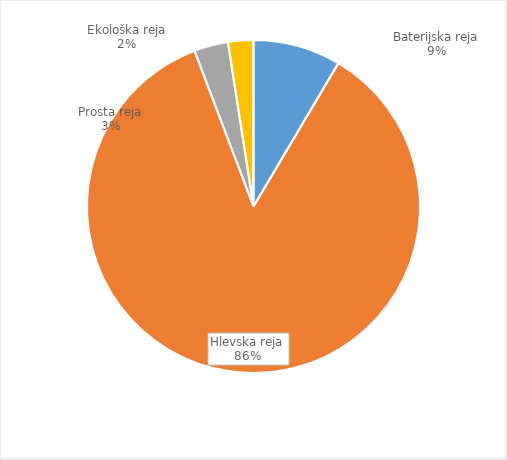
| Category | Količina kosov jajc |
|---|---|
| Baterijska reja | 261288 |
| Hlevska reja | 2631896 |
| Prosta reja | 101434 |
| Ekološka reja | 75480 |